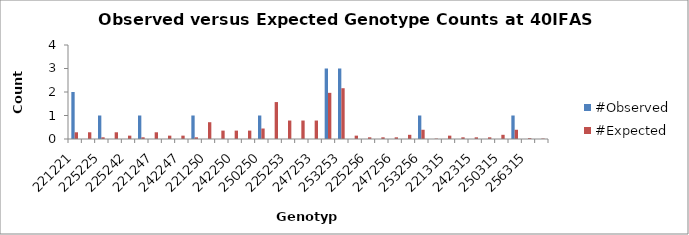
| Category | #Observed | #Expected |
|---|---|---|
| 221221.0 | 2 | 0.286 |
| 221225.0 | 0 | 0.286 |
| 225225.0 | 1 | 0.071 |
| 221242.0 | 0 | 0.286 |
| 225242.0 | 0 | 0.143 |
| 242242.0 | 1 | 0.071 |
| 221247.0 | 0 | 0.286 |
| 225247.0 | 0 | 0.143 |
| 242247.0 | 0 | 0.143 |
| 247247.0 | 1 | 0.071 |
| 221250.0 | 0 | 0.714 |
| 225250.0 | 0 | 0.357 |
| 242250.0 | 0 | 0.357 |
| 247250.0 | 0 | 0.357 |
| 250250.0 | 1 | 0.446 |
| 221253.0 | 0 | 1.571 |
| 225253.0 | 0 | 0.786 |
| 242253.0 | 0 | 0.786 |
| 247253.0 | 0 | 0.786 |
| 250253.0 | 3 | 1.964 |
| 253253.0 | 3 | 2.161 |
| 221256.0 | 0 | 0.143 |
| 225256.0 | 0 | 0.071 |
| 242256.0 | 0 | 0.071 |
| 247256.0 | 0 | 0.071 |
| 250256.0 | 0 | 0.179 |
| 253256.0 | 1 | 0.393 |
| 256256.0 | 0 | 0.018 |
| 221315.0 | 0 | 0.143 |
| 225315.0 | 0 | 0.071 |
| 242315.0 | 0 | 0.071 |
| 247315.0 | 0 | 0.071 |
| 250315.0 | 0 | 0.179 |
| 253315.0 | 1 | 0.393 |
| 256315.0 | 0 | 0.036 |
| 315315.0 | 0 | 0.018 |